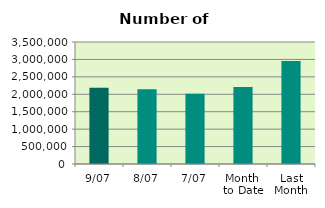
| Category | Series 0 |
|---|---|
| 9/07 | 2185402 |
| 8/07 | 2141976 |
| 7/07 | 2013208 |
| Month 
to Date | 2210050 |
| Last
Month | 2956123.091 |